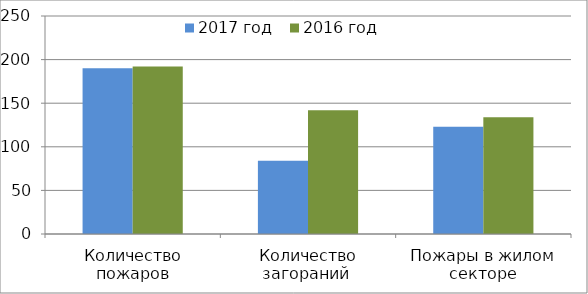
| Category | 2017 год | 2016 год |
|---|---|---|
| Количество пожаров | 190 | 192 |
| Количество загораний  | 84 | 142 |
| Пожары в жилом секторе | 123 | 134 |